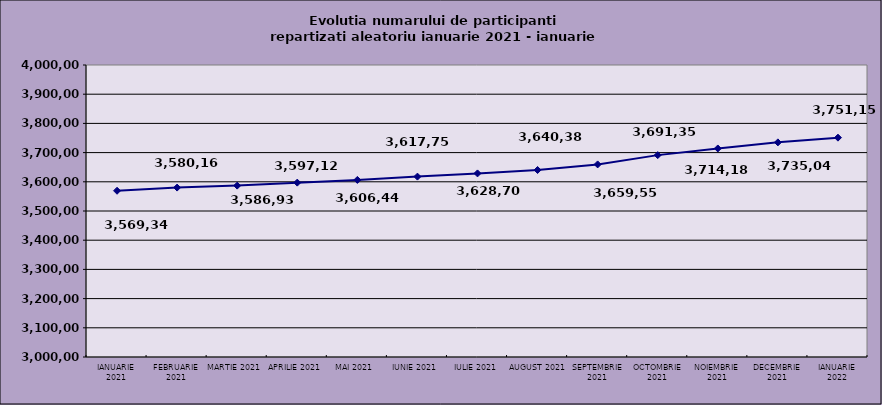
| Category | Series 0 |
|---|---|
| IANUARIE 2021 | 3569344 |
| FEBRUARIE 2021 | 3580169 |
| MARTIE 2021 | 3586933 |
| APRILIE 2021 | 3597129 |
| MAI 2021 | 3606448 |
| IUNIE 2021 | 3617753 |
| IULIE 2021 | 3628706 |
| AUGUST 2021 | 3640384 |
| SEPTEMBRIE 2021 | 3659554 |
| OCTOMBRIE 2021 | 3691352 |
| NOIEMBRIE 2021 | 3714184 |
| DECEMBRIE 2021 | 3735043 |
| IANUARIE 2022 | 3751158 |